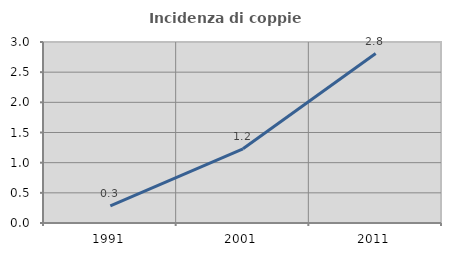
| Category | Incidenza di coppie miste |
|---|---|
| 1991.0 | 0.284 |
| 2001.0 | 1.23 |
| 2011.0 | 2.809 |